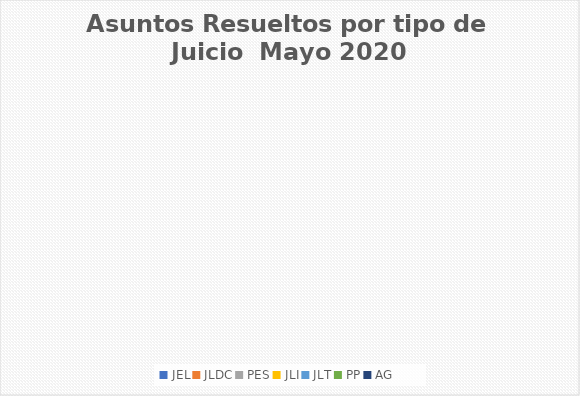
| Category | Asuntos Resueltos por tipo de Juicio  Mayo |
|---|---|
| JEL | 0 |
| JLDC | 0 |
| PES | 0 |
| JLI | 0 |
| JLT | 0 |
| PP | 0 |
| AG | 0 |